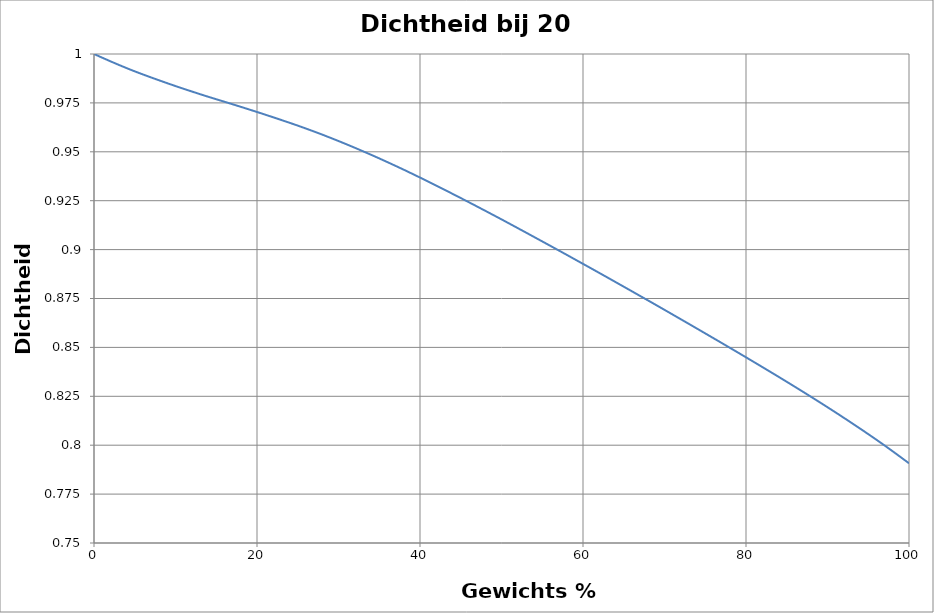
| Category | Series 0 |
|---|---|
| 0.0 | 1 |
| 1.0 | 0.998 |
| 2.0 | 0.996 |
| 3.0 | 0.995 |
| 4.0 | 0.993 |
| 5.0 | 0.991 |
| 6.0 | 0.99 |
| 7.0 | 0.988 |
| 8.0 | 0.987 |
| 9.0 | 0.985 |
| 10.0 | 0.984 |
| 11.0 | 0.982 |
| 12.0 | 0.981 |
| 13.0 | 0.979 |
| 14.0 | 0.978 |
| 15.0 | 0.977 |
| 16.0 | 0.976 |
| 17.0 | 0.974 |
| 18.0 | 0.973 |
| 19.0 | 0.972 |
| 20.0 | 0.97 |
| 21.0 | 0.969 |
| 22.0 | 0.968 |
| 23.0 | 0.966 |
| 24.0 | 0.965 |
| 25.0 | 0.963 |
| 26.0 | 0.962 |
| 27.0 | 0.96 |
| 28.0 | 0.959 |
| 29.0 | 0.957 |
| 30.0 | 0.956 |
| 31.0 | 0.954 |
| 32.0 | 0.952 |
| 33.0 | 0.95 |
| 34.0 | 0.948 |
| 35.0 | 0.947 |
| 36.0 | 0.945 |
| 37.0 | 0.943 |
| 38.0 | 0.941 |
| 39.0 | 0.939 |
| 40.0 | 0.937 |
| 41.0 | 0.935 |
| 42.0 | 0.933 |
| 43.0 | 0.931 |
| 44.0 | 0.928 |
| 45.0 | 0.926 |
| 46.0 | 0.924 |
| 47.0 | 0.922 |
| 48.0 | 0.92 |
| 49.0 | 0.918 |
| 50.0 | 0.915 |
| 51.0 | 0.913 |
| 52.0 | 0.911 |
| 53.0 | 0.909 |
| 54.0 | 0.906 |
| 55.0 | 0.904 |
| 56.0 | 0.902 |
| 57.0 | 0.9 |
| 58.0 | 0.897 |
| 59.0 | 0.895 |
| 60.0 | 0.893 |
| 61.0 | 0.89 |
| 62.0 | 0.888 |
| 63.0 | 0.886 |
| 64.0 | 0.883 |
| 65.0 | 0.881 |
| 66.0 | 0.879 |
| 67.0 | 0.876 |
| 68.0 | 0.874 |
| 69.0 | 0.872 |
| 70.0 | 0.869 |
| 71.0 | 0.867 |
| 72.0 | 0.864 |
| 73.0 | 0.862 |
| 74.0 | 0.86 |
| 75.0 | 0.857 |
| 76.0 | 0.855 |
| 77.0 | 0.852 |
| 78.0 | 0.85 |
| 79.0 | 0.847 |
| 80.0 | 0.845 |
| 81.0 | 0.842 |
| 82.0 | 0.84 |
| 83.0 | 0.837 |
| 84.0 | 0.835 |
| 85.0 | 0.832 |
| 86.0 | 0.83 |
| 87.0 | 0.827 |
| 88.0 | 0.825 |
| 89.0 | 0.822 |
| 90.0 | 0.819 |
| 91.0 | 0.817 |
| 92.0 | 0.814 |
| 93.0 | 0.811 |
| 94.0 | 0.808 |
| 95.0 | 0.806 |
| 96.0 | 0.803 |
| 97.0 | 0.8 |
| 98.0 | 0.797 |
| 99.0 | 0.794 |
| 100.0 | 0.791 |